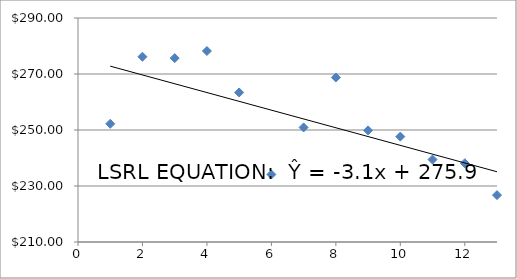
| Category | Series 0 |
|---|---|
| 1.0 | 252.22 |
| 2.0 | 276.16 |
| 3.0 | 275.67 |
| 4.0 | 278.21 |
| 5.0 | 263.4 |
| 6.0 | 234.12 |
| 7.0 | 250.91 |
| 8.0 | 268.76 |
| 9.0 | 249.87 |
| 10.0 | 247.65 |
| 11.0 | 239.45 |
| 12.0 | 238.12 |
| 13.0 | 226.75 |